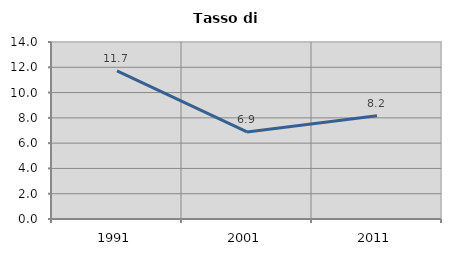
| Category | Tasso di disoccupazione   |
|---|---|
| 1991.0 | 11.712 |
| 2001.0 | 6.883 |
| 2011.0 | 8.16 |